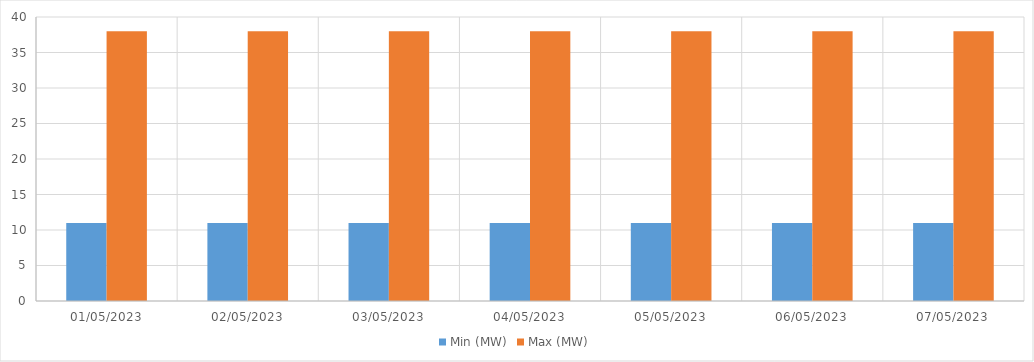
| Category | Min (MW) | Max (MW) |
|---|---|---|
| 01/05/2023 | 11 | 38 |
| 02/05/2023 | 11 | 38 |
| 03/05/2023 | 11 | 38 |
| 04/05/2023 | 11 | 38 |
| 05/05/2023 | 11 | 38 |
| 06/05/2023 | 11 | 38 |
| 07/05/2023 | 11 | 38 |